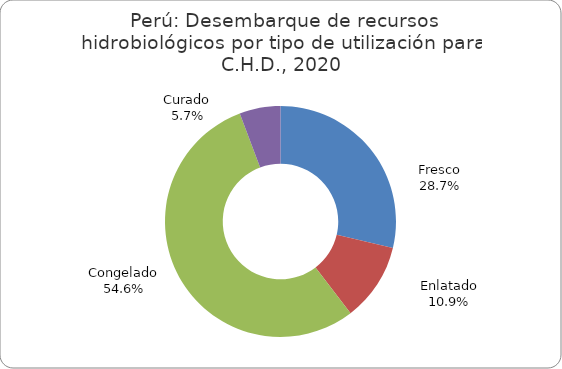
| Category | Series 0 |
|---|---|
| Fresco | 385178.45 |
| Enlatado | 146705.66 |
| Congelado | 733280 |
| Curado | 76953 |